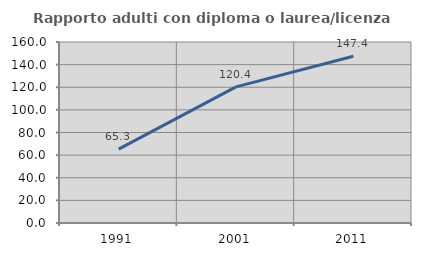
| Category | Rapporto adulti con diploma o laurea/licenza media  |
|---|---|
| 1991.0 | 65.323 |
| 2001.0 | 120.354 |
| 2011.0 | 147.379 |